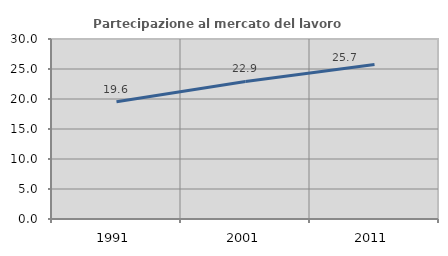
| Category | Partecipazione al mercato del lavoro  femminile |
|---|---|
| 1991.0 | 19.559 |
| 2001.0 | 22.927 |
| 2011.0 | 25.734 |